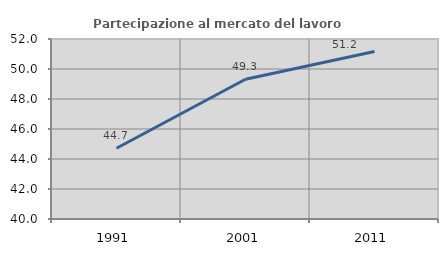
| Category | Partecipazione al mercato del lavoro  femminile |
|---|---|
| 1991.0 | 44.72 |
| 2001.0 | 49.317 |
| 2011.0 | 51.172 |